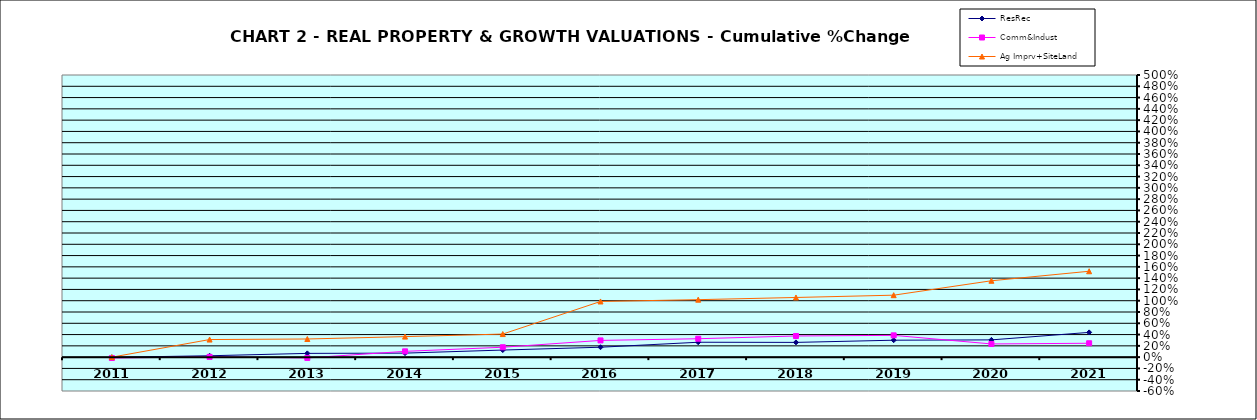
| Category | ResRec | Comm&Indust | Ag Imprv+SiteLand |
|---|---|---|---|
| 2011.0 | -0.003 | -0.015 | 0 |
| 2012.0 | 0.024 | 0.005 | 0.312 |
| 2013.0 | 0.067 | -0.014 | 0.322 |
| 2014.0 | 0.071 | 0.103 | 0.364 |
| 2015.0 | 0.126 | 0.176 | 0.409 |
| 2016.0 | 0.176 | 0.296 | 0.987 |
| 2017.0 | 0.264 | 0.326 | 1.019 |
| 2018.0 | 0.261 | 0.375 | 1.057 |
| 2019.0 | 0.3 | 0.386 | 1.098 |
| 2020.0 | 0.306 | 0.234 | 1.354 |
| 2021.0 | 0.439 | 0.246 | 1.522 |